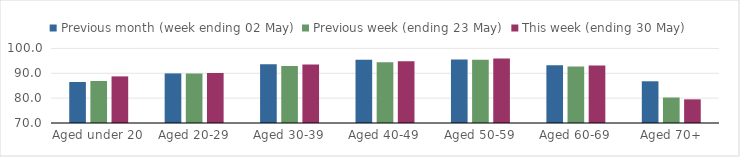
| Category | Previous month (week ending 02 May) | Previous week (ending 23 May) | This week (ending 30 May) |
|---|---|---|---|
| Aged under 20 | 86.498 | 86.908 | 88.75 |
| Aged 20-29 | 89.949 | 89.914 | 90.114 |
| Aged 30-39 | 93.645 | 92.964 | 93.51 |
| Aged 40-49 | 95.443 | 94.484 | 94.885 |
| Aged 50-59 | 95.542 | 95.411 | 95.923 |
| Aged 60-69 | 93.251 | 92.761 | 93.162 |
| Aged 70+ | 86.786 | 80.259 | 79.52 |